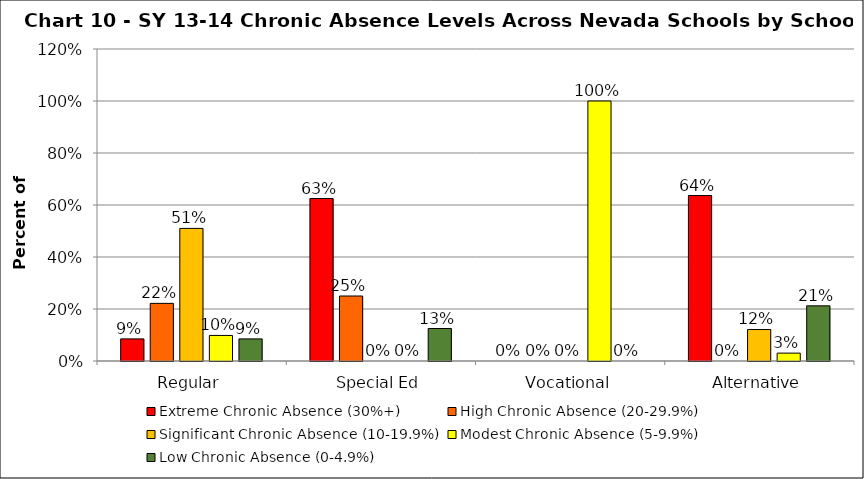
| Category | Extreme Chronic Absence (30%+) | High Chronic Absence (20-29.9%) | Significant Chronic Absence (10-19.9%) | Modest Chronic Absence (5-9.9%) | Low Chronic Absence (0-4.9%) |
|---|---|---|---|---|---|
| 0 | 0.085 | 0.222 | 0.51 | 0.098 | 0.085 |
| 1 | 0.625 | 0.25 | 0 | 0 | 0.125 |
| 2 | 0 | 0 | 0 | 1 | 0 |
| 3 | 0.636 | 0 | 0.121 | 0.03 | 0.212 |